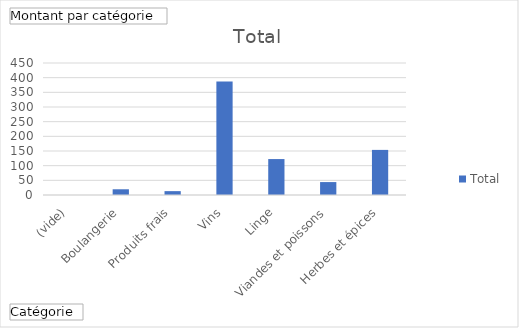
| Category | Total |
|---|---|
| (vide) | 0 |
| Boulangerie | 19.5 |
| Produits frais | 13.17 |
| Vins | 387 |
| Linge | 122.5 |
| Viandes et poissons | 44.075 |
| Herbes et épices | 153.75 |